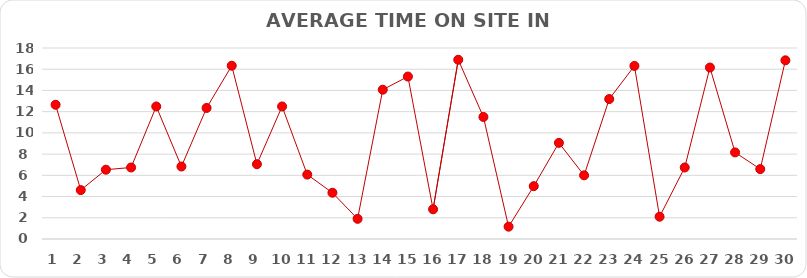
| Category | AVERAGE TIME ON SITE IN MINUTES |
|---|---|
| 1.0 | 12.65 |
| 2.0 | 4.61 |
| 3.0 | 6.53 |
| 4.0 | 6.74 |
| 5.0 | 12.49 |
| 6.0 | 6.83 |
| 7.0 | 12.35 |
| 8.0 | 16.33 |
| 9.0 | 7.05 |
| 10.0 | 12.49 |
| 11.0 | 6.07 |
| 12.0 | 4.36 |
| 13.0 | 1.9 |
| 14.0 | 14.07 |
| 15.0 | 15.31 |
| 16.0 | 2.8 |
| 17.0 | 16.89 |
| 18.0 | 11.5 |
| 19.0 | 1.16 |
| 20.0 | 4.98 |
| 21.0 | 9.06 |
| 22.0 | 6 |
| 23.0 | 13.19 |
| 24.0 | 16.31 |
| 25.0 | 2.1 |
| 26.0 | 6.74 |
| 27.0 | 16.16 |
| 28.0 | 8.16 |
| 29.0 | 6.59 |
| 30.0 | 16.84 |